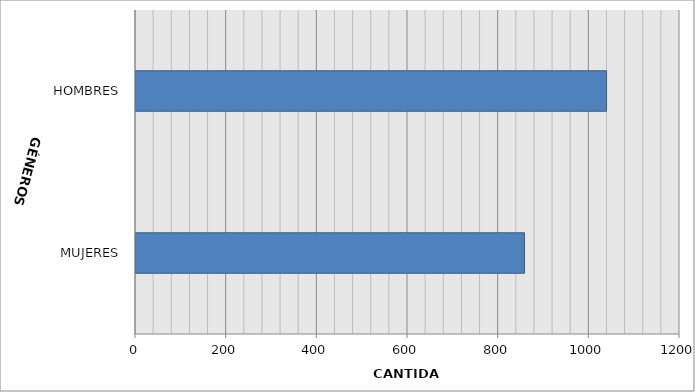
| Category | Series 0 |
|---|---|
| MUJERES | 857 |
| HOMBRES | 1038 |